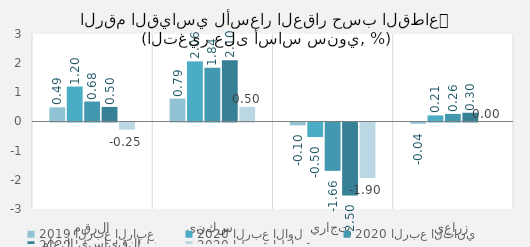
| Category | 2019 | 2020 |
|---|---|---|
| الرقم القياسي العام | 0.485 | -0.248 |
| سكني | 0.786 | 0.5 |
| تجاري | -0.098 | -1.9 |
| زراعي | -0.043 | 0 |